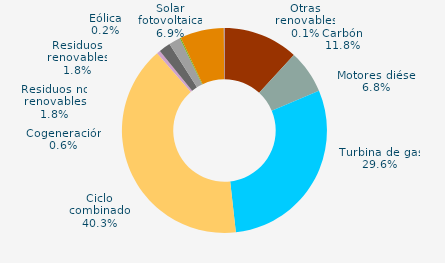
| Category | Series 0 |
|---|---|
| Carbón | 11.827 |
| Motores diésel | 6.835 |
| Turbina de gas | 29.572 |
| Ciclo combinado | 40.349 |
| Generación auxiliar | 0 |
| Cogeneración | 0.565 |
| Residuos no renovables | 1.834 |
| Residuos renovables | 1.834 |
| Eólica | 0.177 |
| Solar fotovoltaica | 6.903 |
| Otras renovables | 0.104 |